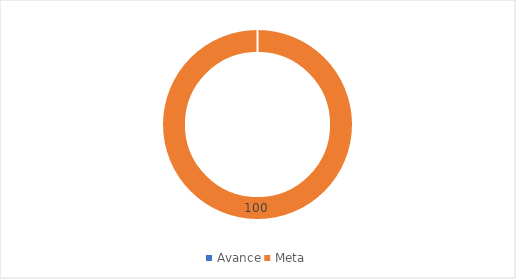
| Category | Series 0 |
|---|---|
| Avance | 0 |
| Meta | 100 |